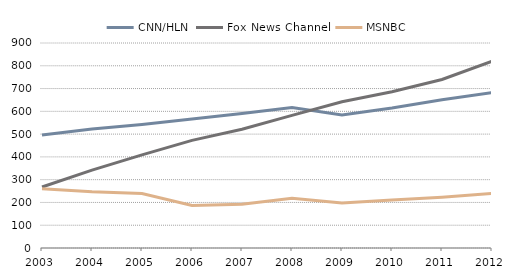
| Category | CNN/HLN | Fox News Channel | MSNBC |
|---|---|---|---|
| 2003.0 | 496 | 267.975 | 260.645 |
| 2004.0 | 522 | 342.153 | 247.148 |
| 2005.0 | 542 | 408.922 | 238.802 |
| 2006.0 | 566 | 472.538 | 186.521 |
| 2007.0 | 590 | 521.431 | 191.734 |
| 2008.0 | 617 | 582.091 | 218.478 |
| 2009.0 | 584 | 641.75 | 197.528 |
| 2010.0 | 615 | 685.752 | 210.471 |
| 2011.0 | 651 | 740 | 223 |
| 2012.0 | 682 | 820 | 240 |